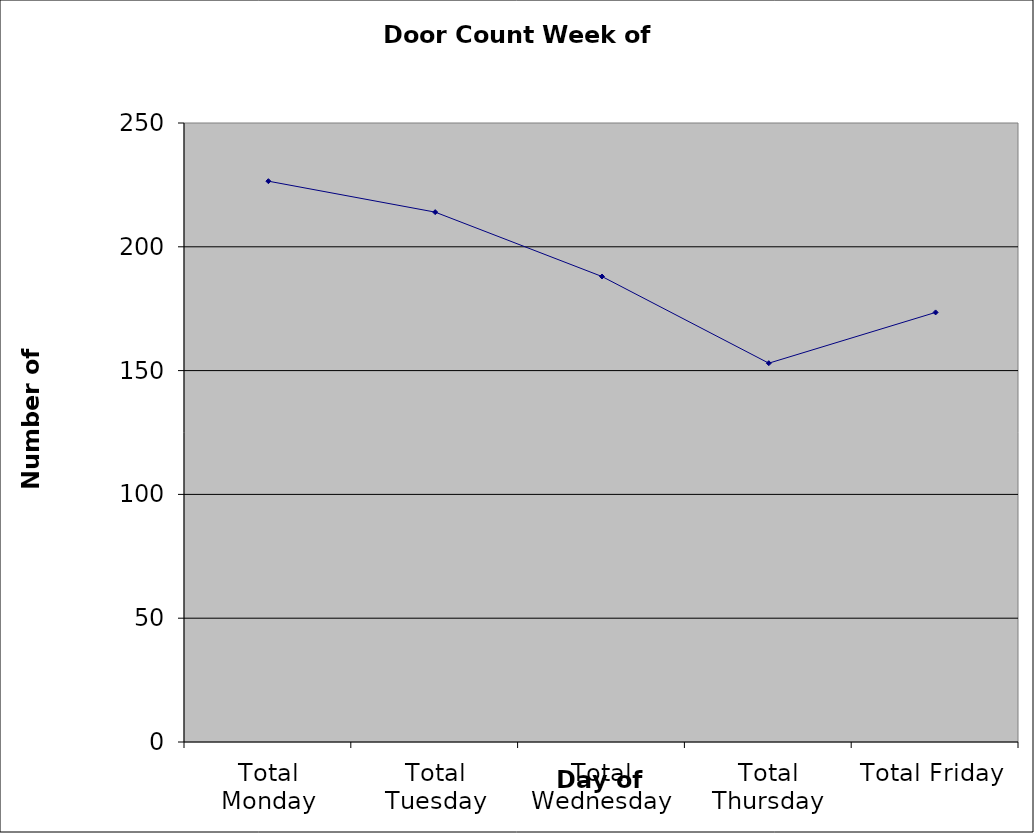
| Category | Series 0 |
|---|---|
| Total Monday | 226.5 |
| Total Tuesday | 214 |
| Total Wednesday | 188 |
| Total Thursday | 153 |
| Total Friday | 173.5 |